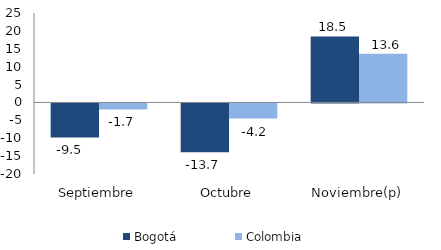
| Category | Bogotá | Colombia |
|---|---|---|
| Septiembre | -9.508 | -1.688 |
| Octubre | -13.654 | -4.239 |
| Noviembre(p) | 18.455 | 13.628 |